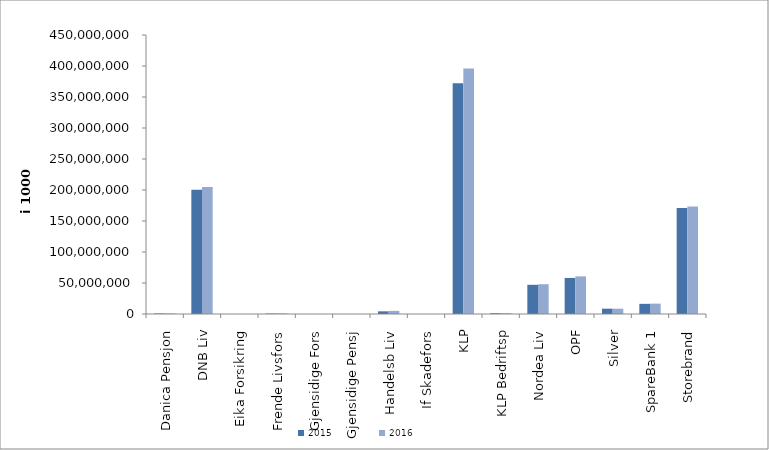
| Category | 2015 | 2016 |
|---|---|---|
| 0 | 855272.663 | 858022.541 |
| 1 | 200420720 | 204843063 |
| 2 | 0 | 0 |
| 3 | 767594 | 923248 |
| 4 | 0 | 0 |
| 5 | 0 | 0 |
| 6 | 4299003.772 | 5002117.166 |
| 7 | 0 | 0 |
| 8 | 372216335.2 | 395861028.5 |
| 9 | 1317960 | 1377725 |
| 10 | 47087476.231 | 48033000.002 |
| 11 | 58160962 | 60671285 |
| 12 | 8577218.713 | 8551421.887 |
| 13 | 16379295.105 | 16731870.539 |
| 14 | 170908033.89 | 173422688.107 |